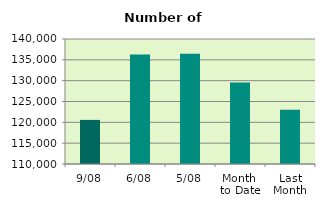
| Category | Series 0 |
|---|---|
| 9/08 | 120582 |
| 6/08 | 136262 |
| 5/08 | 136486 |
| Month 
to Date | 129563.667 |
| Last
Month | 122991 |